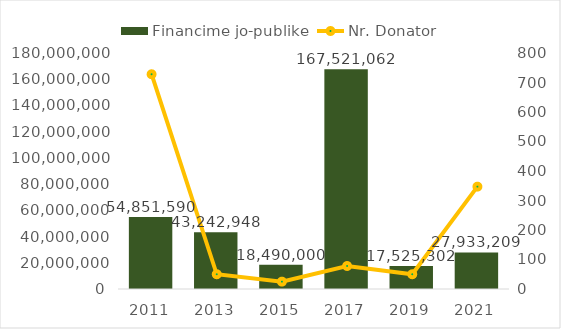
| Category | Financime jo-publike |
|---|---|
| 2011.0 | 54851590 |
| 2013.0 | 43242948 |
| 2015.0 | 18490000 |
| 2017.0 | 167521062 |
| 2019.0 | 17525302 |
| 2021.0 | 27933208.895 |